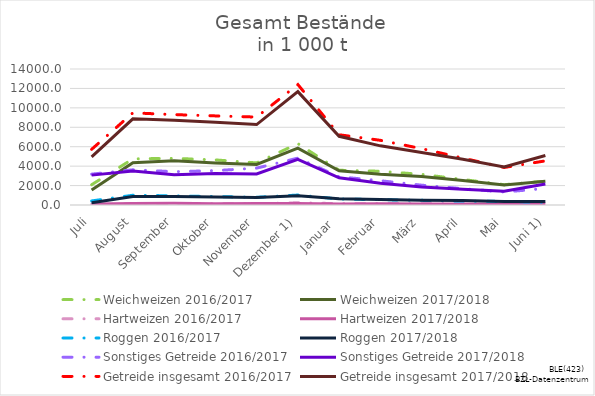
| Category | Weichweizen | Hartweizen | Roggen | Sonstiges Getreide | Getreide insgesamt |
|---|---|---|---|---|---|
| Juli | 1556.632 | 103.528 | 227.568 | 3075.976 | 4963.704 |
| August | 4353.648 | 154.07 | 863.053 | 3504.298 | 8875.069 |
| September | 4561.287 | 167.945 | 883.408 | 3121.868 | 8734.508 |
| Oktober | 4327.199 | 132.94 | 821.297 | 3245.331 | 8526.767 |
| November | 4174.066 | 145.6 | 769.015 | 3189.851 | 8278.531 |
| Dezember 1) | 5851.876 | 161.273 | 949.863 | 4704.355 | 11667.366 |
| Januar  | 3521.499 | 110.274 | 638.413 | 2800.677 | 7070.863 |
| Februar | 3177.75 | 115.841 | 565.807 | 2229.627 | 6089.025 |
| März | 2940.511 | 106.598 | 490.206 | 1858.377 | 5395.692 |
| April | 2521.78 | 100.476 | 452.243 | 1626.853 | 4701.352 |
| Mai | 2067.088 | 91.263 | 350.658 | 1406.427 | 3915.437 |
| Juni 1) | 2441.495 | 131.132 | 354.912 | 2164.465 | 5092.004 |